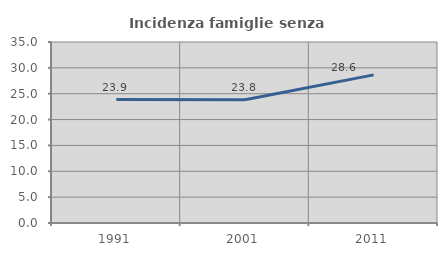
| Category | Incidenza famiglie senza nuclei |
|---|---|
| 1991.0 | 23.871 |
| 2001.0 | 23.823 |
| 2011.0 | 28.64 |